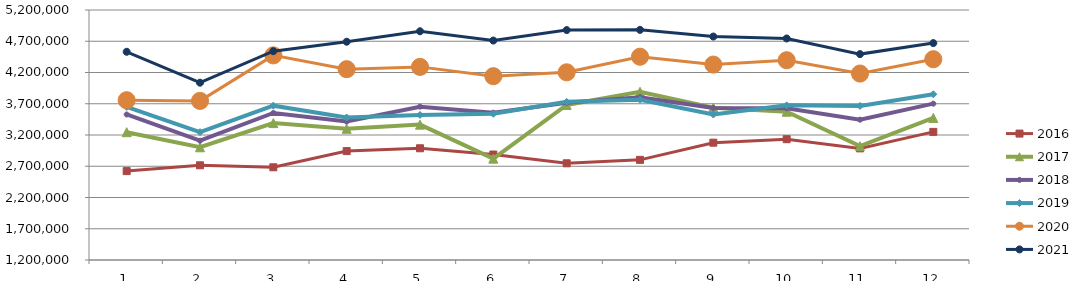
| Category | 2015 | 2016 | 2017 | 2018 | 2019 | 2020 | 2021 |
|---|---|---|---|---|---|---|---|
| 0 |  | 2622357.223 | 3245197.198 | 3528241.229 | 3649683.28 | 3756283.089 | 4531541.153 |
| 1 |  | 2715310.977 | 3003729.629 | 3108555.552 | 3245578.859 | 3745626.569 | 4037286.037 |
| 2 |  | 2683334.081 | 3390554.233 | 3553184.371 | 3669368.201 | 4474226.706 | 4540804.564 |
| 3 |  | 2942696.513 | 3299613.683 | 3414889.226 | 3480737.518 | 4252877.011 | 4692178.419 |
| 4 |  | 2987632.117 | 3365963.719 | 3653293.789 | 3520173.393 | 4289935.067 | 4859630.691 |
| 5 |  | 2887718.315 | 2821580.781 | 3557351.211 | 3540194.304 | 4141054.684 | 4711532.98 |
| 6 |  | 2747166.698 | 3679918.411 | 3714873.235 | 3730287.221 | 4202654.044 | 4878717.093 |
| 7 |  | 2802126.518 | 3891741.582 | 3805404.89 | 3764065.715 | 4452839.823 | 4882258.316 |
| 8 |  | 3077154.853 | 3637785.062 | 3633589.924 | 3528193.213 | 4326562.065 | 4775380.064 |
| 9 |  | 3132986.26 | 3572314.256 | 3626810.501 | 3674095.651 | 4396335.731 | 4744279.495 |
| 10 |  | 2985784.845 | 3021243.296 | 3445044.438 | 3664597.161 | 4182792.836 | 4494280.792 |
| 11 |  | 3249878.984 | 3473156.754 | 3701418.855 | 3851208.606 | 4412374.456 | 4670500.878 |